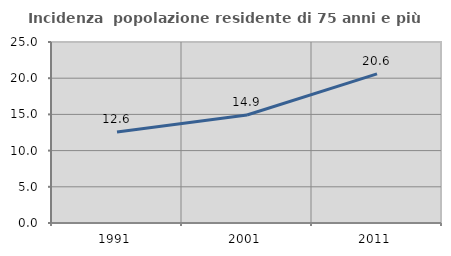
| Category | Incidenza  popolazione residente di 75 anni e più |
|---|---|
| 1991.0 | 12.565 |
| 2001.0 | 14.92 |
| 2011.0 | 20.599 |